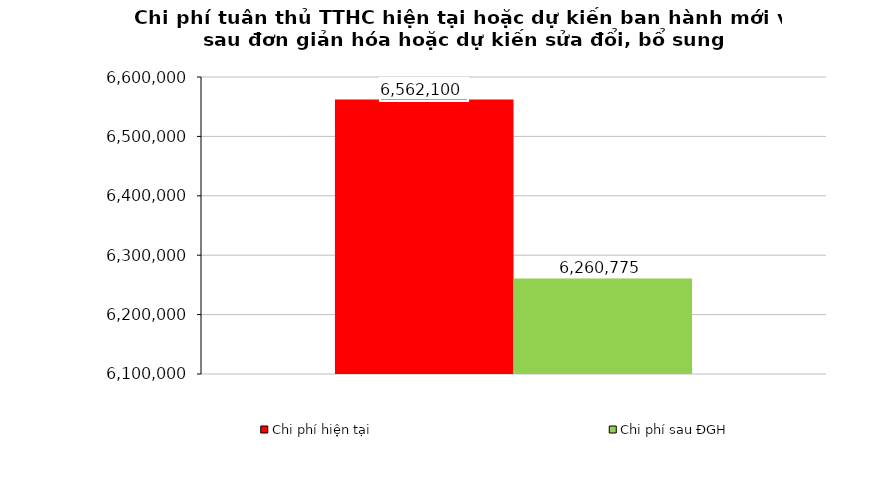
| Category | Chi phí hiện tại | Chi phí sau ĐGH |
|---|---|---|
| 0 | 6562100 | 6260775 |